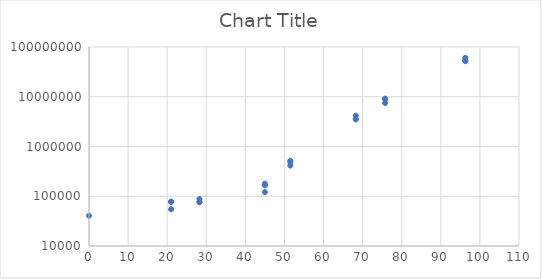
| Category | Series 0 |
|---|---|
| 0.0 | 40472.005 |
| 21.000000000000004 | 77043.371 |
| 21.000000000000004 | 54839.669 |
| 21.000000000000004 | 77847.834 |
| 28.250000000000004 | 76354.076 |
| 28.250000000000004 | 87978.131 |
| 28.250000000000004 | 75805.289 |
| 45.0 | 121112.767 |
| 45.0 | 166226.184 |
| 45.0 | 179387.469 |
| 51.5 | 413464.978 |
| 51.5 | 482985.73 |
| 51.5 | 517314.874 |
| 68.25 | 4165472.148 |
| 68.25 | 3512499.882 |
| 68.25 | 3569819.617 |
| 75.75 | 8823738.868 |
| 75.75 | 7475990.719 |
| 75.75 | 9179348.126 |
| 96.24999999999999 | 60596813.085 |
| 96.24999999999999 | 51950196.042 |
| 96.24999999999999 | 53275279.308 |